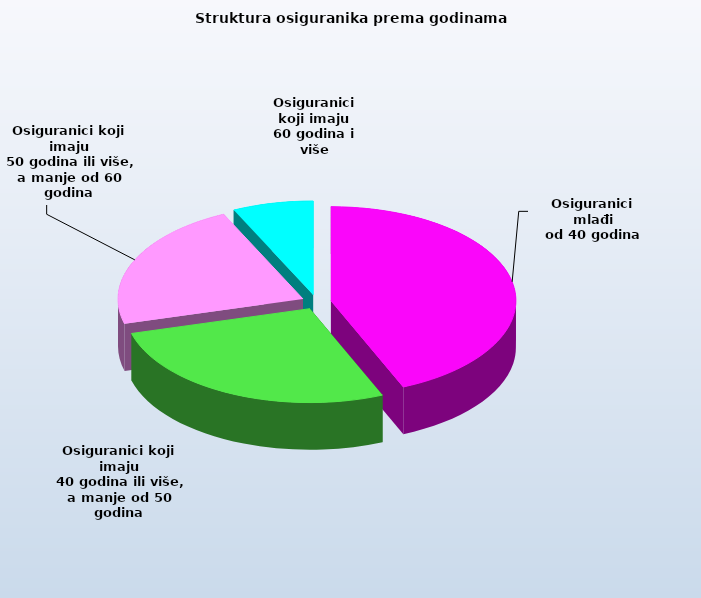
| Category | Series 0 |
|---|---|
| Osiguranici mlađi
od 40 godina | 699429 |
| Osiguranici koji imaju
 40 godina ili više, a manje od 50 godina | 435654 |
| Osiguranici koji imaju
 50 godina ili više, a manje od 60 godina | 356073 |
| Osiguranici koji imaju
60 godina i više | 113297 |